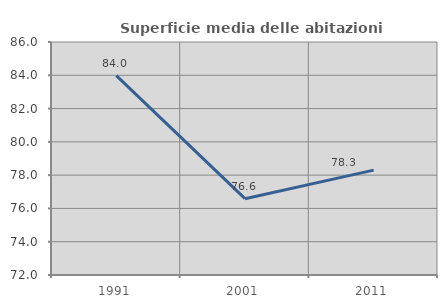
| Category | Superficie media delle abitazioni occupate |
|---|---|
| 1991.0 | 83.981 |
| 2001.0 | 76.584 |
| 2011.0 | 78.301 |